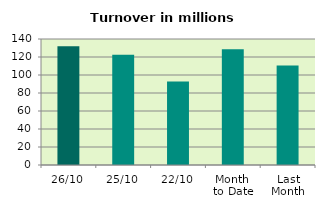
| Category | Series 0 |
|---|---|
| 26/10 | 131.912 |
| 25/10 | 122.509 |
| 22/10 | 92.646 |
| Month 
to Date | 128.664 |
| Last
Month | 110.611 |